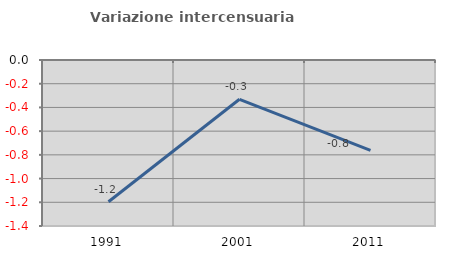
| Category | Variazione intercensuaria annua |
|---|---|
| 1991.0 | -1.196 |
| 2001.0 | -0.331 |
| 2011.0 | -0.762 |